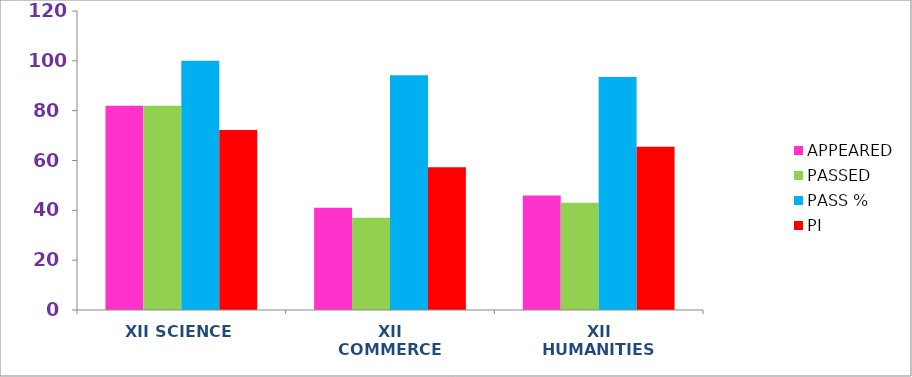
| Category | APPEARED | PASSED | PASS % | PI |
|---|---|---|---|---|
| XII SCIENCE | 82 | 82 | 100 | 72.25 |
| XII COMMERCE | 41 | 37 | 94.24 | 57.32 |
| XII HUMANITIES | 46 | 43 | 93.48 | 65.49 |